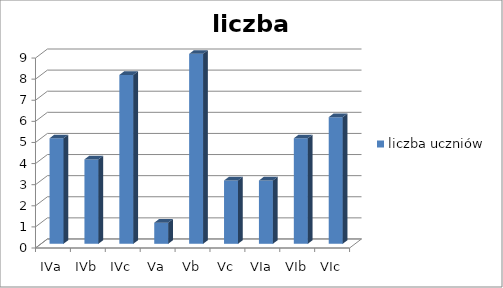
| Category | liczba uczniów |
|---|---|
| IVa | 5 |
| IVb | 4 |
| IVc | 8 |
| Va | 1 |
| Vb | 9 |
| Vc | 3 |
| VIa | 3 |
| VIb | 5 |
| VIc | 6 |